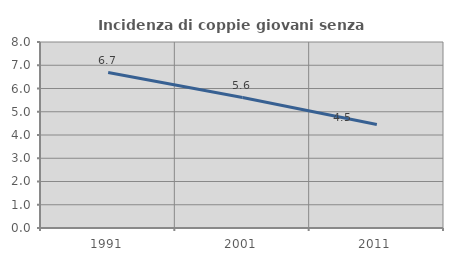
| Category | Incidenza di coppie giovani senza figli |
|---|---|
| 1991.0 | 6.688 |
| 2001.0 | 5.612 |
| 2011.0 | 4.451 |